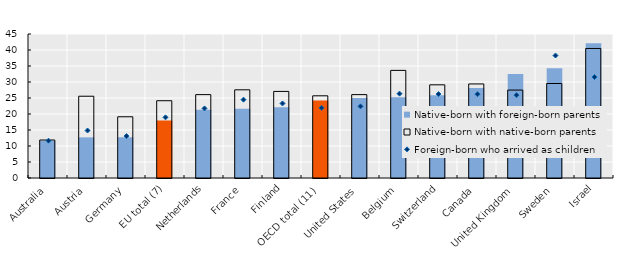
| Category | Native-born with foreign-born parents | Native-born with native-born parents |
|---|---|---|
| Australia | 11.63 | 11.87 |
| Austria | 12.704 | 25.555 |
| Germany | 12.732 | 19.134 |
| EU total (7) | 17.935 | 24.146 |
| Netherlands | 21.32 | 26.056 |
| France | 21.628 | 27.555 |
| Finland | 22.073 | 27.056 |
| OECD total (11) | 24.202 | 25.687 |
| United States | 25.037 | 26.058 |
| Belgium | 25.203 | 33.629 |
| Switzerland | 25.87 | 29.12 |
| Canada | 28.14 | 29.39 |
| United Kingdom | 32.51 | 27.48 |
| Sweden | 34.259 | 29.527 |
| Israel | 42.11 | 40.48 |